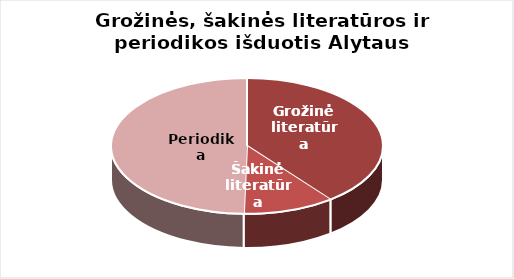
| Category | Series 0 |
|---|---|
| Grožinė literatūra | 508595 |
| Šakinė literatūra | 139888 |
| Periodika | 639029 |